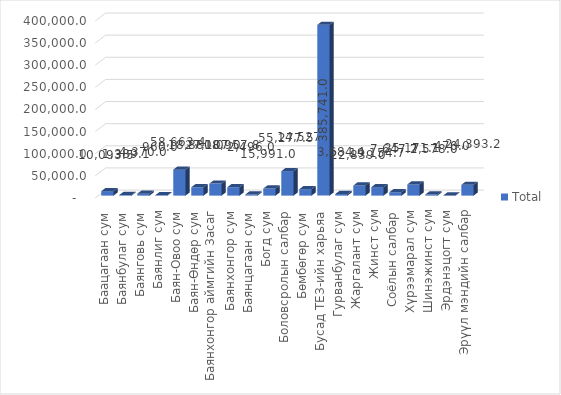
| Category | Total |
|---|---|
| Баацагаан сум | 10093.501 |
| Баянбулаг сум | 1389.1 |
| Баянговь сум | 4370 |
| Баянлиг сум | 960 |
| Баян-Овоо сум | 58663.4 |
| Баян-Өндөр сум | 18880 |
| Баянхонгор аймгийн Засаг дарга | 27106.98 |
| Баянхонгор сум | 18957.802 |
| Баянцагаан сум | 2495.982 |
| Богд сум | 15991 |
| Боловсролын салбар | 55277.467 |
| Бөмбөгөр сум | 14527.617 |
| Бусад ТЕЗ-ийн харьяа | 385740.952 |
| Гурванбулаг сум | 3684.35 |
| Жаргалант сум | 22839.02 |
| Жинст сум | 19154.7 |
| Соёлын салбар | 7647.7 |
| Хүрээмарал сум | 25171.075 |
| Шинэжинст сум | 2578 |
| Эрдэнэцогт сум | 470 |
| Эрүүл мэндийн салбар | 24393.221 |